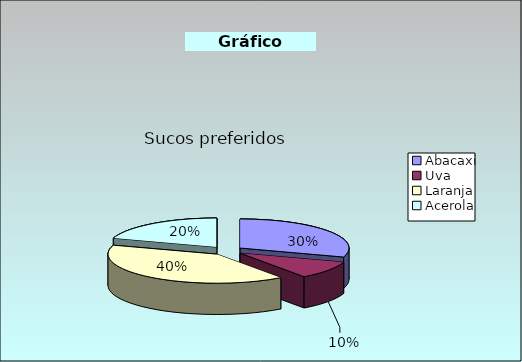
| Category | Preferência |
|---|---|
| Abacaxi | 30 |
| Uva | 10 |
| Laranja | 40 |
| Acerola | 20 |